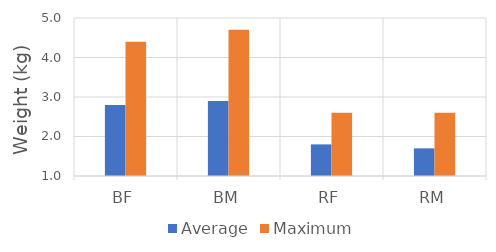
| Category | Average | Maximum |
|---|---|---|
| BF | 2.8 | 4.4 |
| BM | 2.9 | 4.7 |
| RF | 1.8 | 2.6 |
| RM | 1.7 | 2.6 |